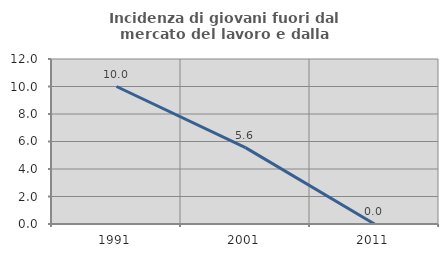
| Category | Incidenza di giovani fuori dal mercato del lavoro e dalla formazione  |
|---|---|
| 1991.0 | 10 |
| 2001.0 | 5.556 |
| 2011.0 | 0 |